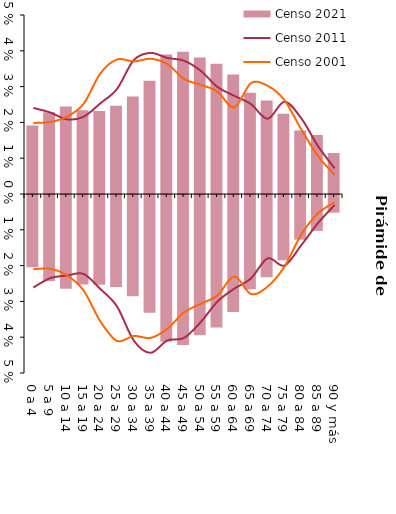
| Category | Censo 2021 | Series 1 |
|---|---|---|
| 0 a 4 | 0.019 | -0.02 |
| 5 a 9 | 0.023 | -0.024 |
| 10 a 14 | 0.024 | -0.026 |
| 15 a 19 | 0.023 | -0.025 |
| 20 a 24 | 0.023 | -0.025 |
| 25 a 29 | 0.025 | -0.026 |
| 30 a 34 | 0.027 | -0.028 |
| 35 a 39 | 0.032 | -0.033 |
| 40 a 44 | 0.039 | -0.041 |
| 45 a 49 | 0.04 | -0.042 |
| 50 a 54 | 0.038 | -0.039 |
| 55 a 59 | 0.036 | -0.037 |
| 60 a 64 | 0.033 | -0.033 |
| 65 a 69 | 0.028 | -0.026 |
| 70 a 74 | 0.026 | -0.023 |
| 75 a 79 | 0.022 | -0.018 |
| 80 a 84 | 0.018 | -0.012 |
| 85 a 89 | 0.016 | -0.01 |
| 90 y más | 0.011 | -0.005 |